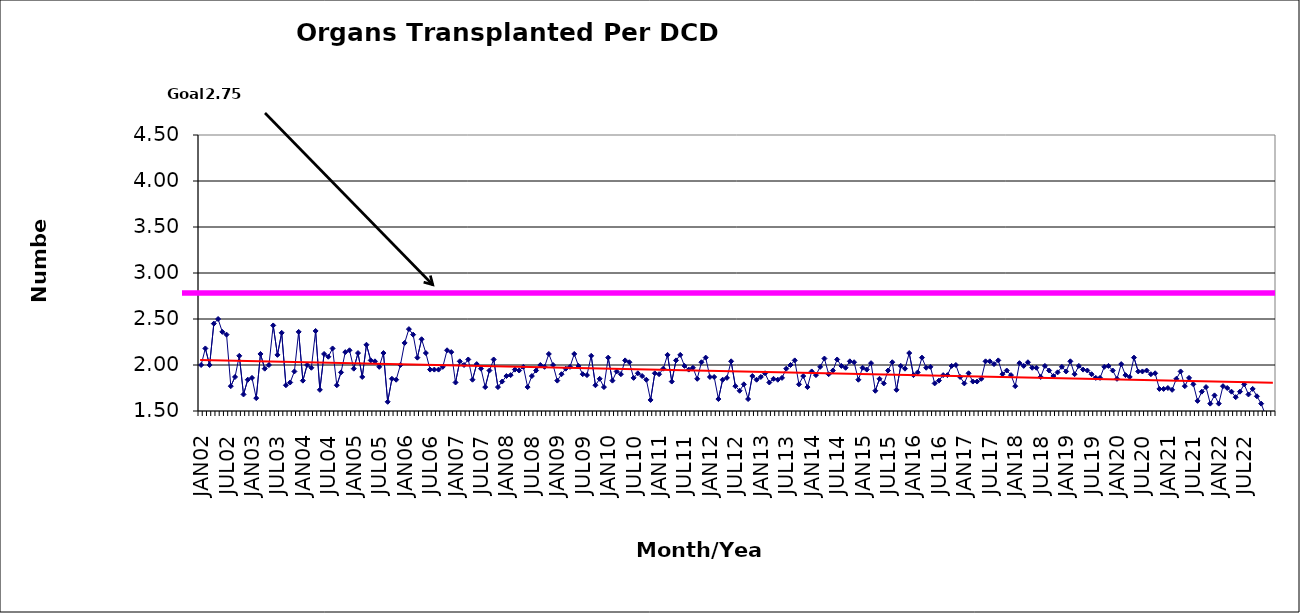
| Category | Series 0 |
|---|---|
| JAN02 | 2 |
| FEB02 | 2.18 |
| MAR02 | 2 |
| APR02 | 2.45 |
| MAY02 | 2.5 |
| JUN02 | 2.36 |
| JUL02 | 2.33 |
| AUG02 | 1.77 |
| SEP02 | 1.87 |
| OCT02 | 2.1 |
| NOV02 | 1.68 |
| DEC02 | 1.84 |
| JAN03 | 1.86 |
| FEB03 | 1.64 |
| MAR03 | 2.12 |
| APR03 | 1.96 |
| MAY03 | 2 |
| JUN03 | 2.43 |
| JUL03 | 2.11 |
| AUG03 | 2.35 |
| SEP03 | 1.78 |
| OCT03 | 1.81 |
| NOV03 | 1.93 |
| DEC03 | 2.36 |
| JAN04 | 1.83 |
| FEB04 | 2 |
| MAR04 | 1.97 |
| APR04 | 2.37 |
| MAY04 | 1.73 |
| JUN04 | 2.12 |
| JUL04 | 2.09 |
| AUG04 | 2.18 |
| SEP04 | 1.78 |
| OCT04 | 1.92 |
| NOV04 | 2.14 |
| DEC04 | 2.16 |
| JAN05 | 1.96 |
| FEB05 | 2.13 |
| MAR05 | 1.87 |
| APR05 | 2.22 |
| MAY05 | 2.05 |
| JUN05 | 2.04 |
| JUL05 | 1.98 |
| AUG05 | 2.13 |
| SEP05 | 1.6 |
| OCT05 | 1.85 |
| NOV05 | 1.84 |
| DEC05 | 2 |
| JAN06 | 2.24 |
| FEB06 | 2.39 |
| MAR06 | 2.33 |
| APR06 | 2.08 |
| MAY06 | 2.28 |
| JUN06 | 2.13 |
| JUL06 | 1.95 |
| AUG06 | 1.95 |
| SEP06 | 1.95 |
| OCT06 | 1.98 |
| NOV06 | 2.16 |
| DEC06 | 2.14 |
| JAN07 | 1.81 |
| FEB07 | 2.04 |
| MAR07 | 2 |
| APR07 | 2.06 |
| MAY07 | 1.84 |
| JUN07 | 2.01 |
| JUL07 | 1.96 |
| AUG07 | 1.76 |
| SEP07 | 1.94 |
| OCT07 | 2.06 |
| NOV07 | 1.76 |
| DEC07 | 1.82 |
| JAN08 | 1.88 |
| FEB08 | 1.89 |
| MAR08 | 1.95 |
| APR08 | 1.94 |
| MAY08 | 1.98 |
| JUN08 | 1.76 |
| JUL08 | 1.88 |
| AUG08 | 1.94 |
| SEP08 | 2 |
| OCT08 | 1.98 |
| NOV08 | 2.12 |
| DEC08 | 2 |
| JAN09 | 1.83 |
| FEB09 | 1.9 |
| MAR09 | 1.96 |
| APR09 | 1.98 |
| MAY09 | 2.12 |
| JUN09 | 1.99 |
| JUL09 | 1.9 |
| AUG09 | 1.89 |
| SEP09 | 2.1 |
| OCT09 | 1.78 |
| NOV09 | 1.85 |
| DEC09 | 1.76 |
| JAN10 | 2.08 |
| FEB10 | 1.83 |
| MAR10 | 1.93 |
| APR10 | 1.9 |
| MAY10 | 2.05 |
| JUN10 | 2.03 |
| JUL10 | 1.86 |
| AUG10 | 1.91 |
| SEP10 | 1.88 |
| OCT10 | 1.84 |
| NOV10 | 1.62 |
| DEC10 | 1.91 |
| JAN11 | 1.9 |
| FEB11 | 1.96 |
| MAR11 | 2.11 |
| APR11 | 1.82 |
| MAY11 | 2.05 |
| JUN11 | 2.11 |
| JUL11 | 1.99 |
| AUG11 | 1.95 |
| SEP11 | 1.97 |
| OCT11 | 1.85 |
| NOV11 | 2.03 |
| DEC11 | 2.08 |
| JAN12 | 1.87 |
| FEB12 | 1.87 |
| MAR12 | 1.63 |
| APR12 | 1.84 |
| MAY12 | 1.86 |
| JUN12 | 2.04 |
| JUL12 | 1.77 |
| AUG12 | 1.72 |
| SEP12 | 1.79 |
| OCT12 | 1.63 |
| NOV12 | 1.88 |
| DEC12 | 1.84 |
| JAN13 | 1.87 |
| FEB13 | 1.91 |
| MAR13 | 1.81 |
| APR13 | 1.85 |
| MAY13 | 1.84 |
| JUN13 | 1.86 |
| JUL13 | 1.96 |
| AUG13 | 2 |
| SEP13 | 2.05 |
| OCT13 | 1.79 |
| NOV13 | 1.88 |
| DEC13 | 1.76 |
| JAN14 | 1.93 |
| FEB14 | 1.89 |
| MAR14 | 1.98 |
| APR14 | 2.07 |
| MAY14 | 1.9 |
| JUN14 | 1.94 |
| JUL14 | 2.06 |
| AUG14 | 1.99 |
| SEP14 | 1.97 |
| OCT14 | 2.04 |
| NOV14 | 2.03 |
| DEC14 | 1.84 |
| JAN15 | 1.97 |
| FEB15 | 1.95 |
| MAR15 | 2.02 |
| APR15 | 1.72 |
| MAY15 | 1.85 |
| JUN15 | 1.8 |
| JUL15 | 1.94 |
| AUG15 | 2.03 |
| SEP15 | 1.73 |
| OCT15 | 1.99 |
| NOV15 | 1.96 |
| DEC15 | 2.13 |
| JAN16 | 1.89 |
| FEB16 | 1.92 |
| MAR16 | 2.08 |
| APR16 | 1.97 |
| MAY16 | 1.98 |
| JUN16 | 1.8 |
| JUL16 | 1.83 |
| AUG16 | 1.89 |
| SEP16 | 1.89 |
| OCT16 | 1.99 |
| NOV16 | 2 |
| DEC16 | 1.87 |
| JAN17 | 1.8 |
| FEB17 | 1.91 |
| MAR17 | 1.82 |
| APR17 | 1.82 |
| MAY17 | 1.85 |
| JUN17 | 2.04 |
| JUL17 | 2.04 |
| AUG17 | 2.01 |
| SEP17 | 2.05 |
| OCT17 | 1.9 |
| NOV17 | 1.94 |
| DEC17 | 1.89 |
| JAN18 | 1.77 |
| FEB18 | 2.02 |
| MAR18 | 1.99 |
| APR18 | 2.03 |
| MAY18 | 1.97 |
| JUN18 | 1.97 |
| JUL18 | 1.87 |
| AUG18 | 1.99 |
| SEP18 | 1.94 |
| OCT18 | 1.88 |
| NOV18 | 1.92 |
| DEC18 | 1.98 |
| JAN19 | 1.93 |
| FEB19 | 2.04 |
| MAR19 | 1.9 |
| APR19 | 1.99 |
| MAY19 | 1.95 |
| JUN19 | 1.94 |
| JUL19 | 1.9 |
| AUG19 | 1.86 |
| SEP19 | 1.86 |
| OCT19 | 1.98 |
| NOV19 | 1.99 |
| DEC19 | 1.94 |
| JAN20 | 1.85 |
| FEB20 | 2.01 |
| MAR20 | 1.89 |
| APR20 | 1.87 |
| MAY20 | 2.08 |
| JUN20 | 1.93 |
| JUL20 | 1.93 |
| AUG20 | 1.94 |
| SEP20 | 1.9 |
| OCT20 | 1.91 |
| NOV20 | 1.74 |
| DEC20 | 1.74 |
| JAN21 | 1.75 |
| FEB21 | 1.73 |
| MAR21 | 1.85 |
| APR21 | 1.93 |
| MAY21 | 1.77 |
| JUN21 | 1.86 |
| JUL21 | 1.79 |
| AUG21 | 1.61 |
| SEP21 | 1.71 |
| OCT21 | 1.76 |
| NOV21 | 1.58 |
| DEC21 | 1.67 |
| JAN22 | 1.58 |
| FEB22 | 1.77 |
| MAR22 | 1.75 |
| APR22 | 1.71 |
| MAY22 | 1.65 |
| JUN22 | 1.71 |
| JUL22 | 1.79 |
| AUG22 | 1.68 |
| SEP22 | 1.74 |
| OCT22 | 1.66 |
| NOV22 | 1.58 |
| DEC22 | 1.46 |